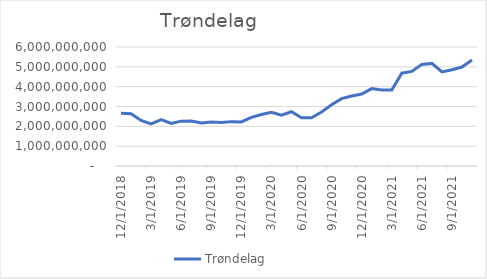
| Category | Trøndelag |
|---|---|
| 12/1/18 | 2663765750.417 |
| 1/1/19 | 2637728250 |
| 2/1/19 | 2293219916.667 |
| 3/1/19 | 2118109083.333 |
| 4/1/19 | 2340048250 |
| 5/1/19 | 2145943666.667 |
| 6/1/19 | 2262522000 |
| 7/1/19 | 2263526166.667 |
| 8/1/19 | 2166476583.333 |
| 9/1/19 | 2214547416.667 |
| 10/1/19 | 2190763333.333 |
| 11/1/19 | 2237196666.667 |
| 12/1/19 | 2219742500 |
| 1/1/20 | 2454967500 |
| 2/1/20 | 2594867500 |
| 3/1/20 | 2705230000 |
| 4/1/20 | 2557475833.333 |
| 5/1/20 | 2736679166.667 |
| 6/1/20 | 2427500000 |
| 7/1/20 | 2434808333.333 |
| 8/1/20 | 2720849166.667 |
| 9/1/20 | 3092249166.667 |
| 10/1/20 | 3395026250 |
| 11/1/20 | 3529538750 |
| 12/1/20 | 3628505416.667 |
| 1/1/21 | 3902684583.333 |
| 2/1/21 | 3834038750 |
| 3/1/21 | 3830776250 |
| 4/1/21 | 4677851250 |
| 5/1/21 | 4769417916.667 |
| 6/1/21 | 5123287083.333 |
| 7/1/21 | 5172178750 |
| 8/1/21 | 4741340416.667 |
| 9/1/21 | 4852986250 |
| 10/1/21 | 4990392500 |
| 11/1/21 | 5344371666.667 |